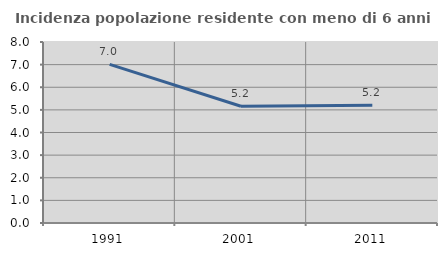
| Category | Incidenza popolazione residente con meno di 6 anni |
|---|---|
| 1991.0 | 7.013 |
| 2001.0 | 5.158 |
| 2011.0 | 5.203 |